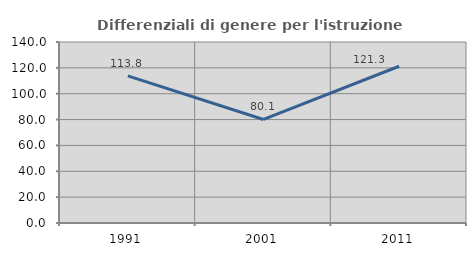
| Category | Differenziali di genere per l'istruzione superiore |
|---|---|
| 1991.0 | 113.806 |
| 2001.0 | 80.089 |
| 2011.0 | 121.259 |